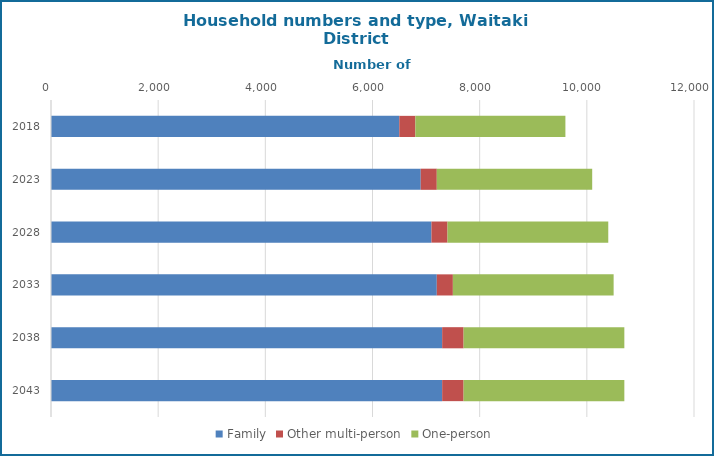
| Category | Family | Other multi-person | One-person |
|---|---|---|---|
| 2018.0 | 6500 | 300 | 2800 |
| 2023.0 | 6900 | 300 | 2900 |
| 2028.0 | 7100 | 300 | 3000 |
| 2033.0 | 7200 | 300 | 3000 |
| 2038.0 | 7300 | 400 | 3000 |
| 2043.0 | 7300 | 400 | 3000 |